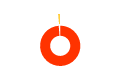
| Category | Series 0 |
|---|---|
| 0 | 346.224 |
| 1 | 4.153 |